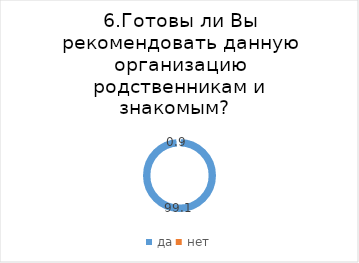
| Category | Series 0 |
|---|---|
| да | 99.138 |
| нет | 0.862 |